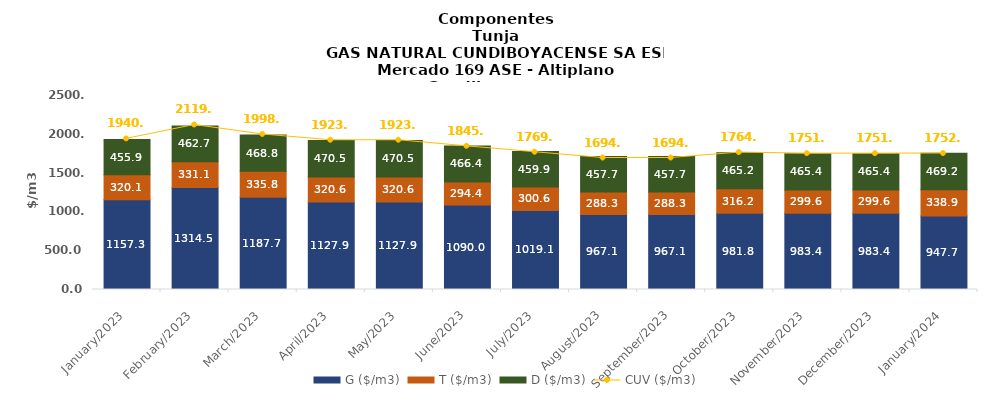
| Category | G ($/m3) | T ($/m3) | D ($/m3) |
|---|---|---|---|
| 2023-01-01 | 1157.27 | 320.12 | 455.93 |
| 2023-02-01 | 1314.49 | 331.09 | 462.69 |
| 2023-03-01 | 1187.7 | 335.79 | 468.75 |
| 2023-04-01 | 1127.9 | 320.55 | 470.54 |
| 2023-05-01 | 1127.9 | 320.55 | 470.54 |
| 2023-06-01 | 1090.01 | 294.4 | 466.35 |
| 2023-07-01 | 1019.05 | 300.55 | 459.92 |
| 2023-08-01 | 967.08 | 288.3 | 457.73 |
| 2023-09-01 | 967.08 | 288.3 | 457.72 |
| 2023-10-01 | 981.83 | 316.2 | 465.18 |
| 2023-11-01 | 983.39 | 299.62 | 465.37 |
| 2023-12-01 | 983.39 | 299.62 | 465.37 |
| 2024-01-01 | 947.72 | 338.94 | 469.19 |